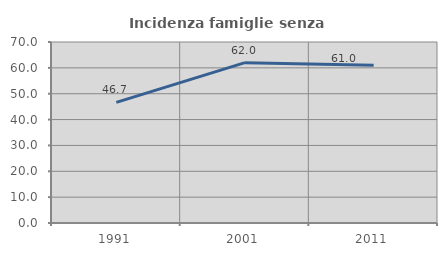
| Category | Incidenza famiglie senza nuclei |
|---|---|
| 1991.0 | 46.667 |
| 2001.0 | 62 |
| 2011.0 | 60.976 |